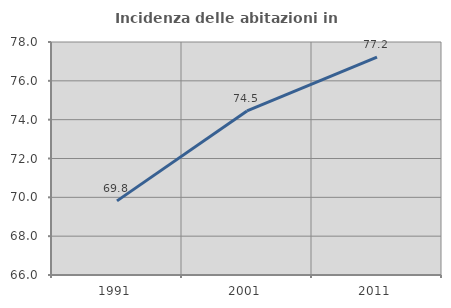
| Category | Incidenza delle abitazioni in proprietà  |
|---|---|
| 1991.0 | 69.818 |
| 2001.0 | 74.451 |
| 2011.0 | 77.217 |